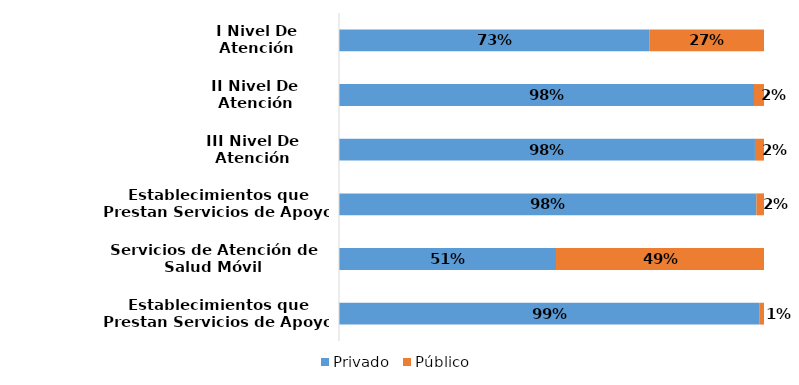
| Category | Privado | Público |
|---|---|---|
| I Nivel De Atención | 0.73 | 0.27 |
| II Nivel De Atención | 0.977 | 0.023 |
| III Nivel De Atención | 0.979 | 0.021 |
| Establecimientos que Prestan Servicios de Apoyo | 0.982 | 0.018 |
| Servicios de Atención de Salud Móvil | 0.511 | 0.489 |
| Establecimientos que Prestan Servicios de Apoyo Indirecto | 0.989 | 0.011 |